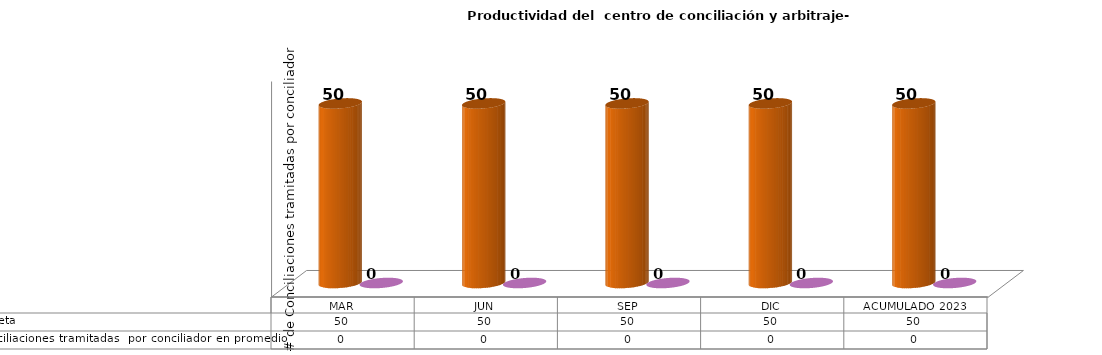
| Category | % Meta | Conciliaciones tramitadas  por conciliador en promedio |
|---|---|---|
| MAR | 50 | 0 |
| JUN | 50 | 0 |
| SEP | 50 | 0 |
| DIC | 50 | 0 |
| ACUMULADO 2023 | 50 | 0 |